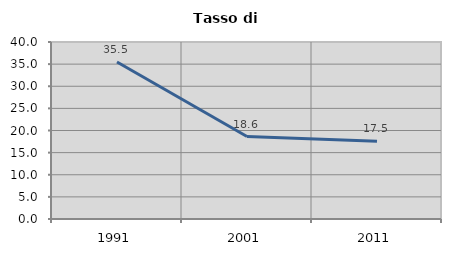
| Category | Tasso di disoccupazione   |
|---|---|
| 1991.0 | 35.484 |
| 2001.0 | 18.644 |
| 2011.0 | 17.544 |